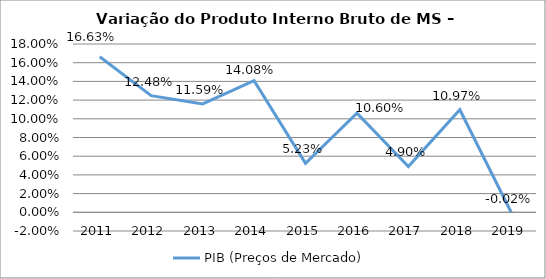
| Category | PIB (Preços de Mercado) |
|---|---|
| 2011.0 | 0.166 |
| 2012.0 | 0.125 |
| 2013.0 | 0.116 |
| 2014.0 | 0.141 |
| 2015.0 | 0.052 |
| 2016.0 | 0.106 |
| 2017.0 | 0.049 |
| 2018.0 | 0.11 |
| 2019.0 | 0 |